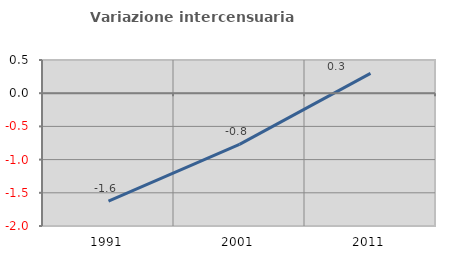
| Category | Variazione intercensuaria annua |
|---|---|
| 1991.0 | -1.627 |
| 2001.0 | -0.772 |
| 2011.0 | 0.298 |